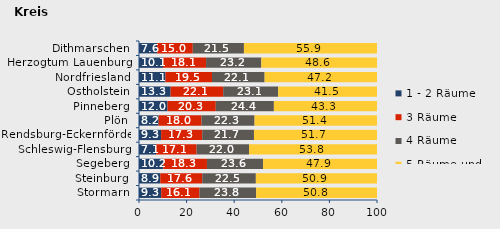
| Category | 1 - 2 Räume | 3 Räume | 4 Räume | 5 Räume und mehr |
|---|---|---|---|---|
| Stormarn | 9.322 | 16.075 | 23.829 | 50.774 |
| Steinburg | 8.931 | 17.643 | 22.525 | 50.901 |
| Segeberg | 10.218 | 18.335 | 23.58 | 47.867 |
| Schleswig-Flensburg | 7.144 | 17.064 | 22.021 | 53.77 |
| Rendsburg-Eckernförde | 9.29 | 17.273 | 21.748 | 51.689 |
| Plön | 8.242 | 18.013 | 22.301 | 51.444 |
| Pinneberg | 11.99 | 20.271 | 24.412 | 43.326 |
| Ostholstein | 13.283 | 22.07 | 23.133 | 41.513 |
| Nordfriesland | 11.14 | 19.545 | 22.097 | 47.219 |
| Herzogtum Lauenburg | 10.083 | 18.102 | 23.21 | 48.605 |
| Dithmarschen | 7.606 | 14.994 | 21.49 | 55.91 |